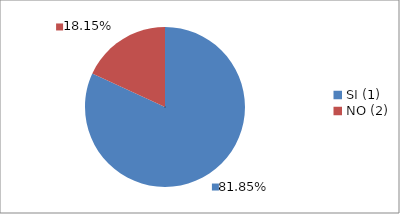
| Category | Series 0 |
|---|---|
| SI (1) | 0.818 |
| NO (2) | 0.182 |